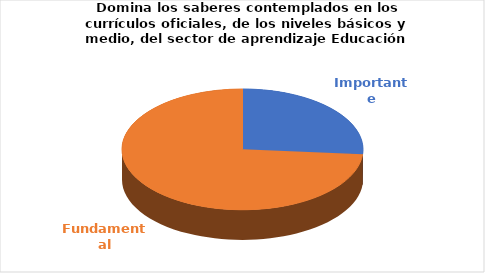
| Category | Series 0 |
|---|---|
| Importante | 5 |
| Fundamental | 14 |